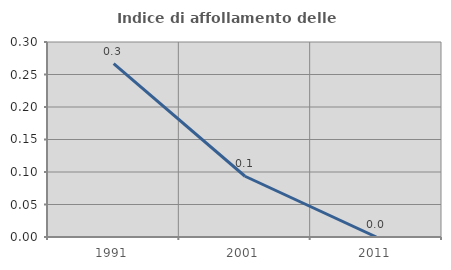
| Category | Indice di affollamento delle abitazioni  |
|---|---|
| 1991.0 | 0.267 |
| 2001.0 | 0.093 |
| 2011.0 | 0 |